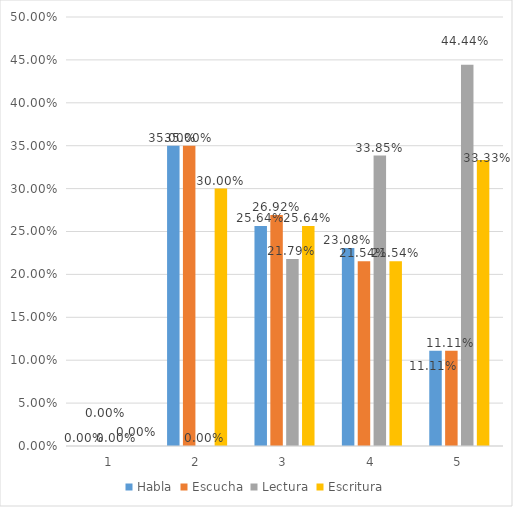
| Category | Habla | Escucha | Lectura | Escritura |
|---|---|---|---|---|
| 0 | 0 | 0 | 0 | 0 |
| 1 | 0.35 | 0.35 | 0 | 0.3 |
| 2 | 0.256 | 0.269 | 0.218 | 0.256 |
| 3 | 0.231 | 0.215 | 0.338 | 0.215 |
| 4 | 0.111 | 0.111 | 0.444 | 0.333 |